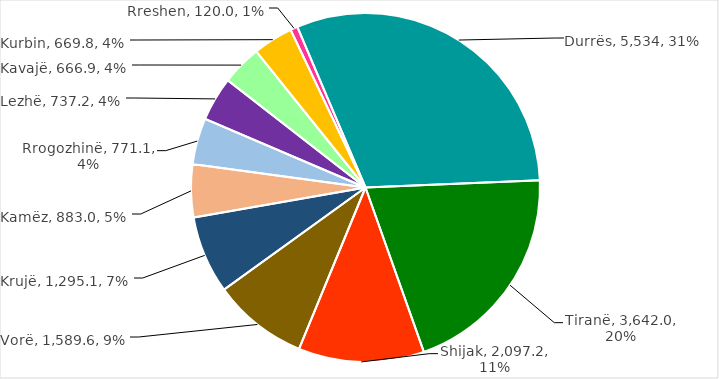
| Category | Value in Million Lek | Share against the Total |
|---|---|---|
| Durrës | 5534.132 | 0.307 |
| Tiranë | 3642.007 | 0.202 |
| Shijak | 2097.161 | 0.116 |
| Vorë | 1589.576 | 0.088 |
| Krujë | 1295.092 | 0.072 |
| Kamëz | 883.044 | 0.049 |
| Rrogozhinë | 771.097 | 0.043 |
| Lezhë | 737.191 | 0.041 |
| Kavajë | 666.938 | 0.037 |
| Kurbin | 669.767 | 0.037 |
| Rreshen | 119.963 | 0.007 |